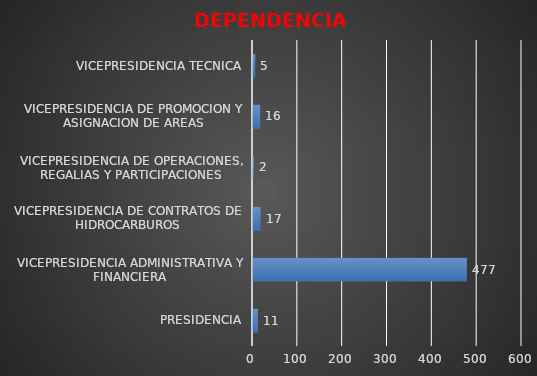
| Category | DEPENDENCIAS 3º TRIMESTRE 2020 |
|---|---|
| PRESIDENCIA | 11 |
| VICEPRESIDENCIA ADMINISTRATIVA Y FINANCIERA | 477 |
| VICEPRESIDENCIA DE CONTRATOS DE HIDROCARBUROS | 17 |
| VICEPRESIDENCIA DE OPERACIONES, REGALIAS Y PARTICIPACIONES | 2 |
| VICEPRESIDENCIA DE PROMOCION Y ASIGNACION DE AREAS | 16 |
| VICEPRESIDENCIA TECNICA | 5 |